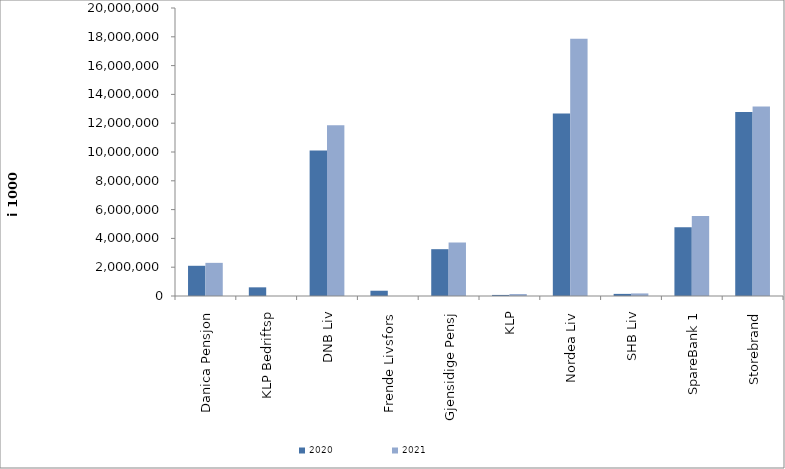
| Category | 2020 | 2021 |
|---|---|---|
| Danica Pensjon | 2098292.548 | 2301876.503 |
| KLP Bedriftsp | 601762 | 0 |
| DNB Liv | 10110496 | 11851242.042 |
| Frende Livsfors | 366321.7 | 0 |
| Gjensidige Pensj | 3251091 | 3714294 |
| KLP | 74308.708 | 135009.071 |
| Nordea Liv | 12668233 | 17865814 |
| SHB Liv | 146915.302 | 178297.445 |
| SpareBank 1 | 4778935.571 | 5555744.369 |
| Storebrand | 12778507.597 | 13164375.305 |